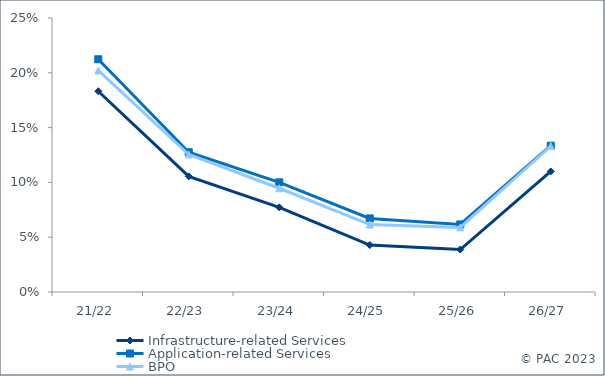
| Category | Infrastructure-related Services | Application-related Services | BPO |
|---|---|---|---|
| 21/22 | 0.183 | 0.212 | 0.202 |
| 22/23 | 0.106 | 0.128 | 0.125 |
| 23/24 | 0.077 | 0.1 | 0.095 |
| 24/25 | 0.043 | 0.067 | 0.062 |
| 25/26 | 0.039 | 0.062 | 0.059 |
| 26/27 | 0.11 | 0.133 | 0.133 |